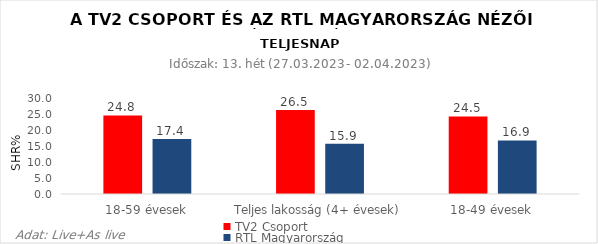
| Category | TV2 Csoport | RTL Magyarország |
|---|---|---|
| 18-59 évesek | 24.8 | 17.4 |
| Teljes lakosság (4+ évesek) | 26.5 | 15.9 |
| 18-49 évesek | 24.5 | 16.9 |